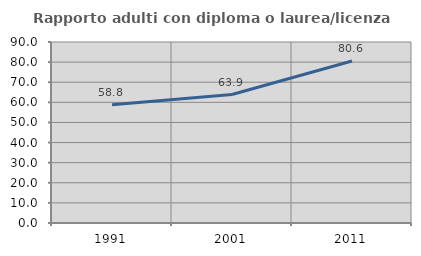
| Category | Rapporto adulti con diploma o laurea/licenza media  |
|---|---|
| 1991.0 | 58.824 |
| 2001.0 | 63.889 |
| 2011.0 | 80.556 |